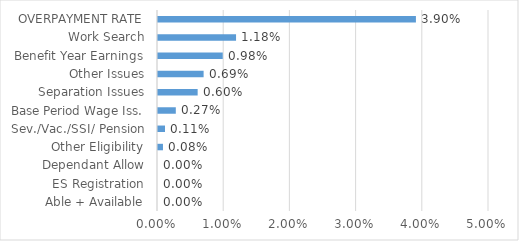
| Category | Series 0 |
|---|---|
| Able + Available | 0 |
| ES Registration | 0 |
| Dependant Allow | 0 |
| Other Eligibility | 0.001 |
| Sev./Vac./SSI/ Pension | 0.001 |
| Base Period Wage Iss. | 0.003 |
| Separation Issues | 0.006 |
| Other Issues | 0.007 |
| Benefit Year Earnings | 0.01 |
| Work Search | 0.012 |
| OVERPAYMENT RATE | 0.039 |